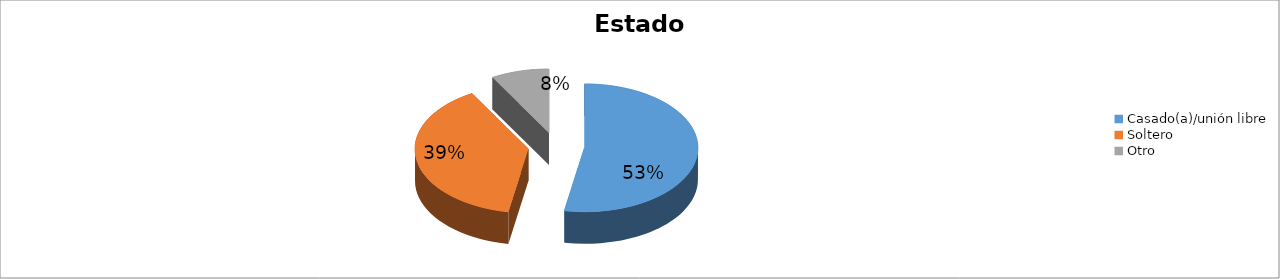
| Category | Series 0 |
|---|---|
| Casado(a)/unión libre | 0.528 |
| Soltero | 0.389 |
| Otro | 0.083 |